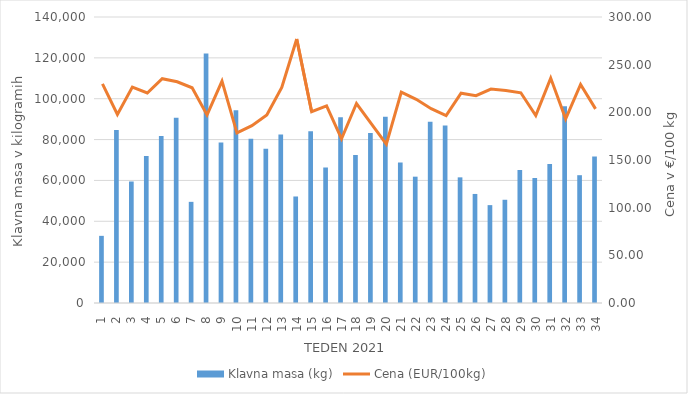
| Category | Klavna masa (kg) |
|---|---|
| 1.0 | 32871 |
| 2.0 | 84639 |
| 3.0 | 59476 |
| 4.0 | 72013 |
| 5.0 | 81759 |
| 6.0 | 90669 |
| 7.0 | 49517 |
| 8.0 | 122111 |
| 9.0 | 78545 |
| 10.0 | 94384 |
| 11.0 | 80405 |
| 12.0 | 75534 |
| 13.0 | 82440 |
| 14.0 | 52143 |
| 15.0 | 84105 |
| 16.0 | 66298 |
| 17.0 | 90925 |
| 18.0 | 72394 |
| 19.0 | 83193 |
| 20.0 | 91231 |
| 21.0 | 68763 |
| 22.0 | 61837 |
| 23.0 | 88747 |
| 24.0 | 86888 |
| 25.0 | 61507 |
| 26.0 | 53379 |
| 27.0 | 47910 |
| 28.0 | 50529 |
| 29.0 | 65062 |
| 30.0 | 61178 |
| 31.0 | 67992 |
| 32.0 | 96308 |
| 33.0 | 62558 |
| 34.0 | 71729 |